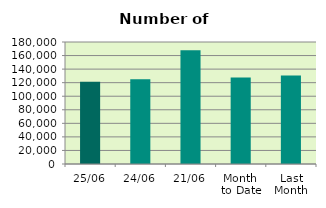
| Category | Series 0 |
|---|---|
| 25/06 | 121536 |
| 24/06 | 125122 |
| 21/06 | 167998 |
| Month 
to Date | 127764.235 |
| Last
Month | 130647.636 |